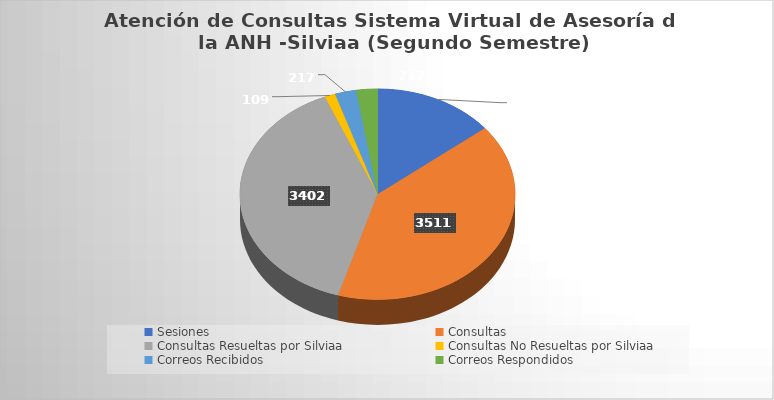
| Category | Total |
|---|---|
| Sesiones | 1237 |
| Consultas | 3511 |
| Consultas Resueltas por Silviaa | 3402 |
| Consultas No Resueltas por Silviaa | 109 |
| Correos Recibidos | 217 |
| Correos Respondidos | 217 |